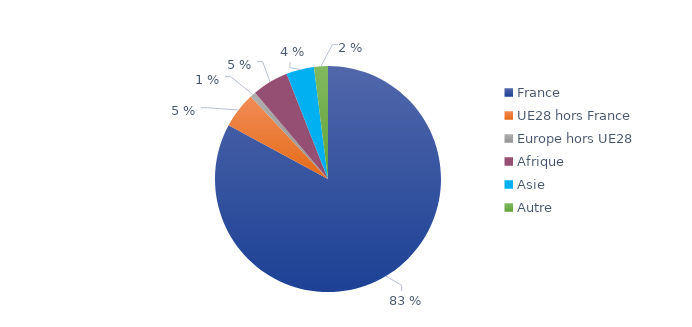
| Category | Series 0 |
|---|---|
| France | 0.834 |
| UE28 hors France | 0.051 |
| Europe hors UE28 | 0.008 |
| Afrique | 0.052 |
| Asie | 0.04 |
| Autre | 0.02 |